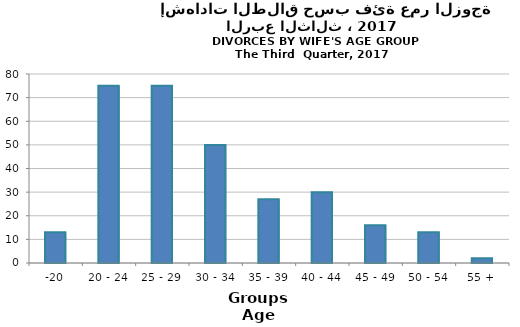
| Category | Series 0 |
|---|---|
| -20 | 13 |
| 20 - 24 | 75 |
| 25 - 29 | 75 |
| 30 - 34 | 50 |
| 35 - 39 | 27 |
| 40 - 44 | 30 |
| 45 - 49 | 16 |
| 50 - 54 | 13 |
| 55 + | 2 |